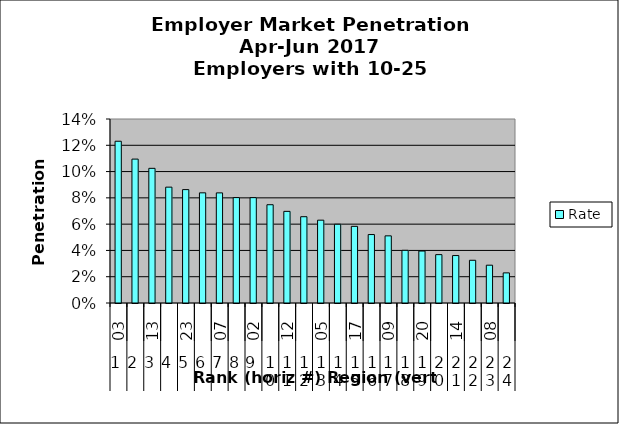
| Category | Rate |
|---|---|
| 0 | 0.123 |
| 1 | 0.109 |
| 2 | 0.102 |
| 3 | 0.088 |
| 4 | 0.086 |
| 5 | 0.084 |
| 6 | 0.084 |
| 7 | 0.08 |
| 8 | 0.08 |
| 9 | 0.075 |
| 10 | 0.07 |
| 11 | 0.066 |
| 12 | 0.063 |
| 13 | 0.06 |
| 14 | 0.058 |
| 15 | 0.052 |
| 16 | 0.051 |
| 17 | 0.04 |
| 18 | 0.04 |
| 19 | 0.037 |
| 20 | 0.036 |
| 21 | 0.033 |
| 22 | 0.029 |
| 23 | 0.023 |